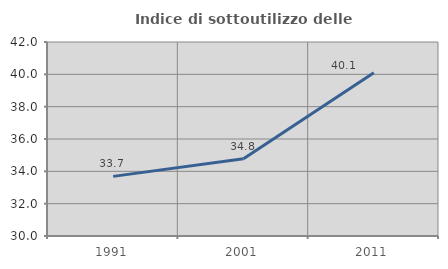
| Category | Indice di sottoutilizzo delle abitazioni  |
|---|---|
| 1991.0 | 33.687 |
| 2001.0 | 34.772 |
| 2011.0 | 40.096 |